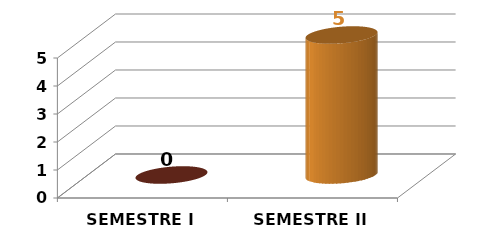
| Category | SEMESTRE I SEMESTRE II |
|---|---|
| SEMESTRE I | 0 |
| SEMESTRE II | 5 |